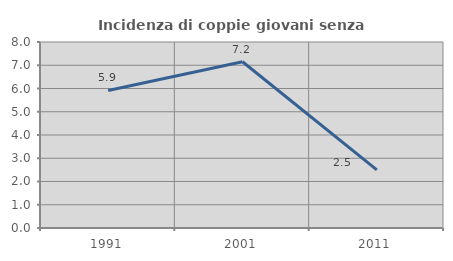
| Category | Incidenza di coppie giovani senza figli |
|---|---|
| 1991.0 | 5.916 |
| 2001.0 | 7.15 |
| 2011.0 | 2.5 |